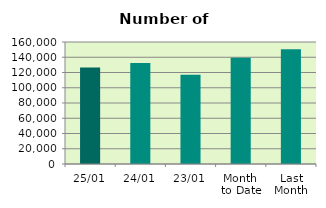
| Category | Series 0 |
|---|---|
| 25/01 | 126646 |
| 24/01 | 132562 |
| 23/01 | 116940 |
| Month 
to Date | 139220.222 |
| Last
Month | 150628.737 |